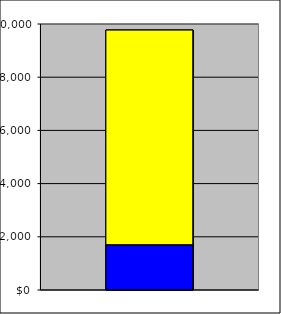
| Category | Series 0 | Series 1 |
|---|---|---|
| 0 | 1704.062 | 8066.938 |